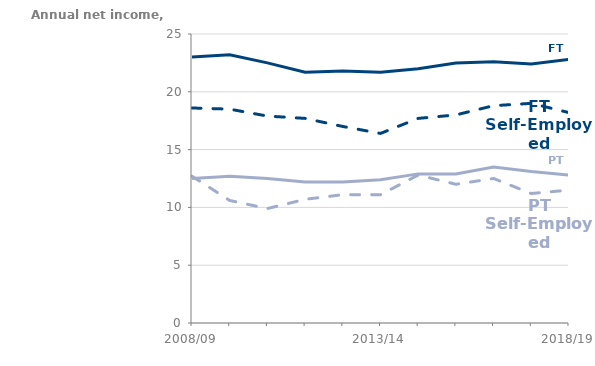
| Category | Full-Time Employees | Part-Time Self-employed | Full-Time Self-Employed | Part-Time Employees |
|---|---|---|---|---|
| 2008/09 | 23000 | 12700 | 18600 | 12500 |
| 2009/10 | 23200 | 10600 | 18500 | 12700 |
| 2010/11 | 22500 | 9900 | 17900 | 12500 |
| 2011/12 | 21700 | 10700 | 17700 | 12200 |
| 2012/13 | 21800 | 11100 | 17000 | 12200 |
| 2013/14 | 21700 | 11100 | 16400 | 12400 |
| 2014/15 | 22000 | 12800 | 17700 | 12900 |
| 2015/16 | 22500 | 12000 | 18000 | 12900 |
| 2016/17 | 22600 | 12500 | 18800 | 13500 |
| 2017/18 | 22400 | 11200 | 19000 | 13100 |
| 2018/19 | 22800 | 11500 | 18200 | 12800 |